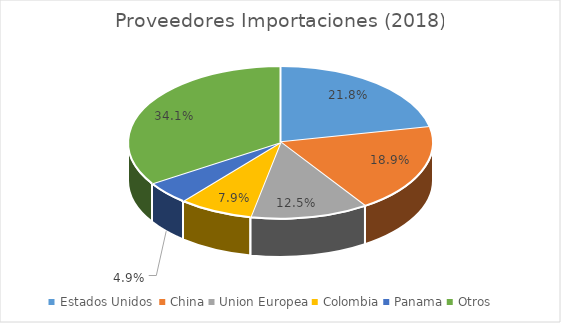
| Category | Participacion |
|---|---|
| Estados Unidos  | 0.218 |
| China | 0.189 |
| Union Europea | 0.125 |
| Colombia | 0.079 |
| Panama | 0.049 |
| Otros | 0.341 |